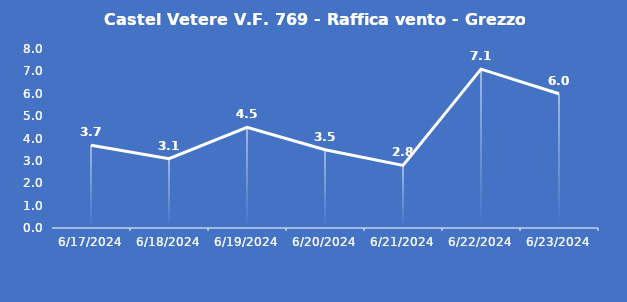
| Category | Castel Vetere V.F. 769 - Raffica vento - Grezzo (m/s) |
|---|---|
| 6/17/24 | 3.7 |
| 6/18/24 | 3.1 |
| 6/19/24 | 4.5 |
| 6/20/24 | 3.5 |
| 6/21/24 | 2.8 |
| 6/22/24 | 7.1 |
| 6/23/24 | 6 |